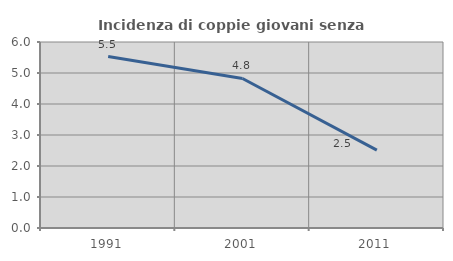
| Category | Incidenza di coppie giovani senza figli |
|---|---|
| 1991.0 | 5.531 |
| 2001.0 | 4.824 |
| 2011.0 | 2.513 |